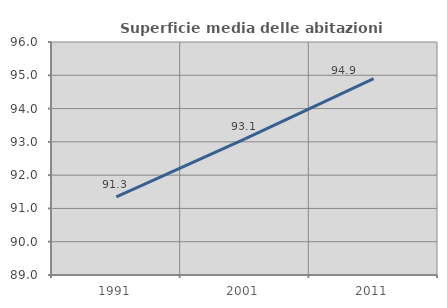
| Category | Superficie media delle abitazioni occupate |
|---|---|
| 1991.0 | 91.345 |
| 2001.0 | 93.087 |
| 2011.0 | 94.899 |